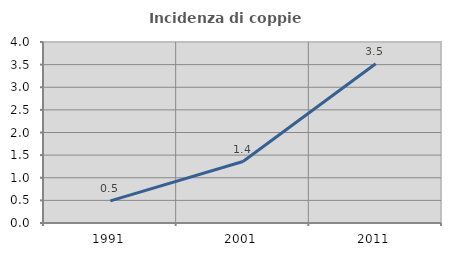
| Category | Incidenza di coppie miste |
|---|---|
| 1991.0 | 0.49 |
| 2001.0 | 1.359 |
| 2011.0 | 3.518 |